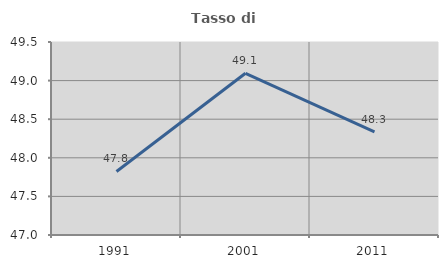
| Category | Tasso di occupazione   |
|---|---|
| 1991.0 | 47.823 |
| 2001.0 | 49.095 |
| 2011.0 | 48.335 |